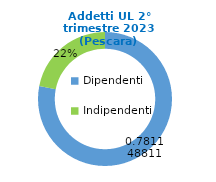
| Category | Series 0 |
|---|---|
| Dipendenti | 73096 |
| Indipendenti | 20479 |